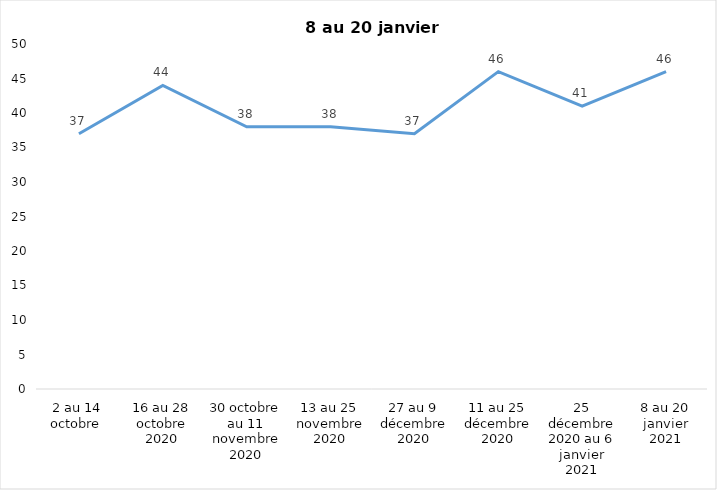
| Category | Toujours aux trois mesures |
|---|---|
| 2 au 14 octobre  | 37 |
| 16 au 28 octobre 2020 | 44 |
| 30 octobre au 11 novembre 2020 | 38 |
| 13 au 25 novembre 2020 | 38 |
| 27 au 9 décembre 2020 | 37 |
| 11 au 25 décembre 2020 | 46 |
| 25 décembre 2020 au 6 janvier 2021 | 41 |
| 8 au 20 janvier 2021 | 46 |